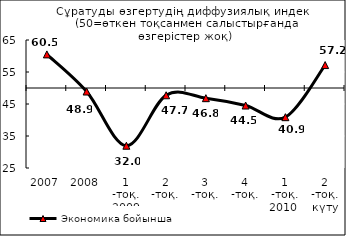
| Category | Экономика бойынша |
|---|---|
| 2007 | 60.5 |
| 2008 | 48.9 |
| 1 -тоқ. 2009 | 31.96 |
| 2 -тоқ.  | 47.725 |
| 3 -тоқ. | 46.82 |
| 4 -тоқ. | 44.525 |
| 1 -тоқ. 2010  | 40.88 |
| 2 -тоқ. күту | 57.165 |